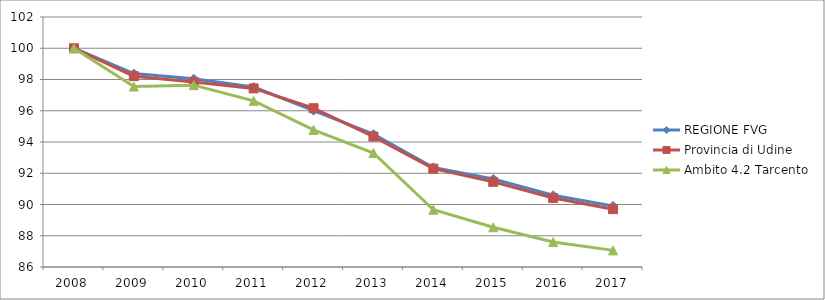
| Category | REGIONE FVG | Provincia di Udine | Ambito 4.2 Tarcento |
|---|---|---|---|
| 2008.0 | 100 | 100 | 100 |
| 2009.0 | 98.378 | 98.213 | 97.549 |
| 2010.0 | 98.049 | 97.839 | 97.637 |
| 2011.0 | 97.515 | 97.431 | 96.633 |
| 2012.0 | 96.012 | 96.162 | 94.773 |
| 2013.0 | 94.5 | 94.348 | 93.296 |
| 2014.0 | 92.37 | 92.296 | 89.663 |
| 2015.0 | 91.632 | 91.451 | 88.541 |
| 2016.0 | 90.595 | 90.414 | 87.596 |
| 2017.0 | 89.908 | 89.702 | 87.064 |